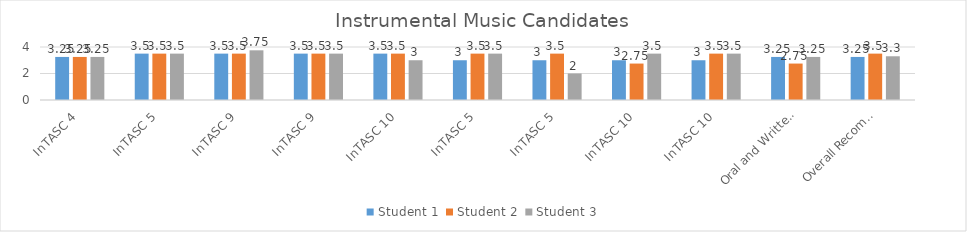
| Category | Student 1 | Student 2 | Student 3 |
|---|---|---|---|
| InTASC 4 | 3.25 | 3.25 | 3.25 |
| InTASC 5 | 3.5 | 3.5 | 3.5 |
| InTASC 9 | 3.5 | 3.5 | 3.75 |
| InTASC 9 | 3.5 | 3.5 | 3.5 |
| InTASC 10 | 3.5 | 3.5 | 3 |
| InTASC 5 | 3 | 3.5 | 3.5 |
| InTASC 5 | 3 | 3.5 | 2 |
| InTASC 10 | 3 | 2.75 | 3.5 |
| InTASC 10 | 3 | 3.5 | 3.5 |
| Oral and Written Communication | 3.25 | 2.75 | 3.25 |
| Overall Recommendation | 3.25 | 3.5 | 3.3 |